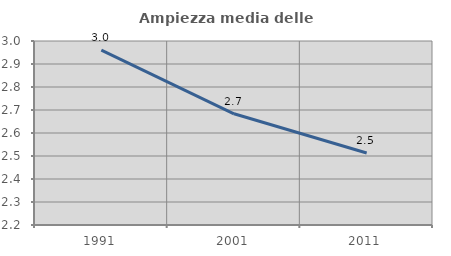
| Category | Ampiezza media delle famiglie |
|---|---|
| 1991.0 | 2.96 |
| 2001.0 | 2.683 |
| 2011.0 | 2.513 |